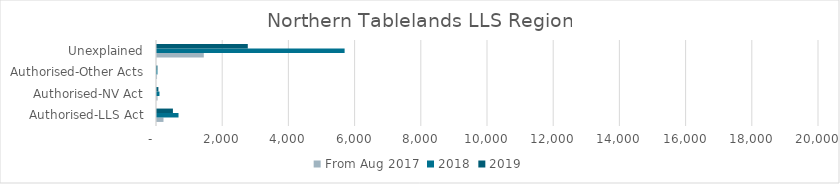
| Category | From Aug 2017 | 2018 | 2019 |
|---|---|---|---|
| Authorised-LLS Act | 196 | 650 | 481 |
| Authorised-NV Act | 17 | 75 | 42 |
| Authorised-Other Acts | 1 | 13 | 13 |
| Unexplained | 1414 | 5668 | 2743 |